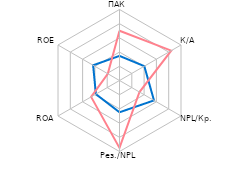
| Category | Србија | Регион |
|---|---|---|
| ПАК | 1.732 | 3.502 |
| К/А | 2.018 | 4.206 |
| NPL/Кр. | 2.804 | 1.625 |
| Рез./NPL | 2.238 | 4.744 |
| ROA | 1.92 | 2.307 |
| ROE | 2.146 | 0.952 |